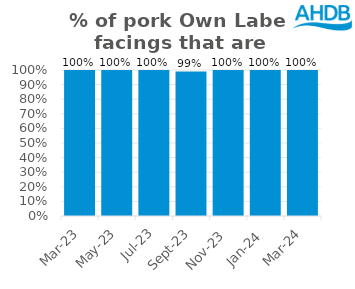
| Category | Pork |
|---|---|
| 2023-03-01 | 1 |
| 2023-05-01 | 1 |
| 2023-07-01 | 1 |
| 2023-09-01 | 0.99 |
| 2023-11-01 | 1 |
| 2024-01-01 | 1 |
| 2024-03-01 | 1 |